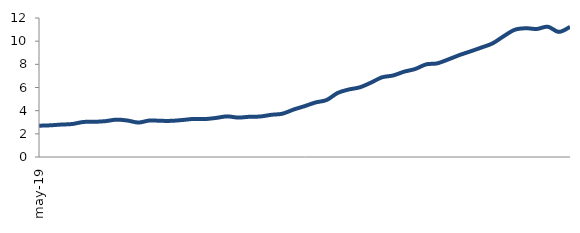
| Category | Series 0 |
|---|---|
| 2019-05-01 | 2.702 |
| 2019-06-01 | 2.733 |
| 2019-07-01 | 2.799 |
| 2019-08-01 | 2.847 |
| 2019-09-01 | 3.023 |
| 2019-10-01 | 3.036 |
| 2019-11-01 | 3.095 |
| 2019-12-01 | 3.225 |
| 2020-01-01 | 3.148 |
| 2020-02-01 | 2.975 |
| 2020-03-01 | 3.153 |
| 2020-04-01 | 3.122 |
| 2020-05-01 | 3.123 |
| 2020-06-01 | 3.198 |
| 2020-07-01 | 3.289 |
| 2020-08-01 | 3.275 |
| 2020-09-01 | 3.372 |
| 2020-10-01 | 3.508 |
| 2020-11-01 | 3.402 |
| 2020-12-01 | 3.472 |
| 2021-01-01 | 3.496 |
| 2021-02-01 | 3.642 |
| 2021-03-01 | 3.737 |
| 2021-04-01 | 4.091 |
| 2021-05-01 | 4.388 |
| 2021-06-01 | 4.708 |
| 2021-07-01 | 4.92 |
| 2021-08-01 | 5.531 |
| 2021-09-01 | 5.826 |
| 2021-10-01 | 6.015 |
| 2021-11-01 | 6.418 |
| 2021-12-01 | 6.877 |
| 2022-01-01 | 7.036 |
| 2022-02-01 | 7.363 |
| 2022-03-01 | 7.597 |
| 2022-04-01 | 7.997 |
| 2022-05-01 | 8.085 |
| 2022-06-01 | 8.423 |
| 2022-07-01 | 8.799 |
| 2022-08-01 | 9.118 |
| 2022-09-01 | 9.453 |
| 2022-10-01 | 9.809 |
| 2022-11-01 | 10.425 |
| 2022-12-01 | 10.982 |
| 2023-01-01 | 11.115 |
| 2023-02-01 | 11.054 |
| 2023-03-01 | 11.245 |
| 2023-04-01 | 10.801 |
| 2023-05-01 | 11.231 |